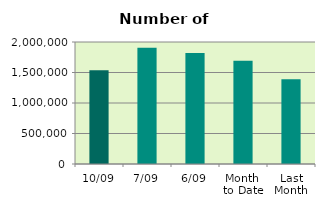
| Category | Series 0 |
|---|---|
| 10/09 | 1538884 |
| 7/09 | 1904266 |
| 6/09 | 1818832 |
| Month 
to Date | 1692128.333 |
| Last
Month | 1391040.957 |